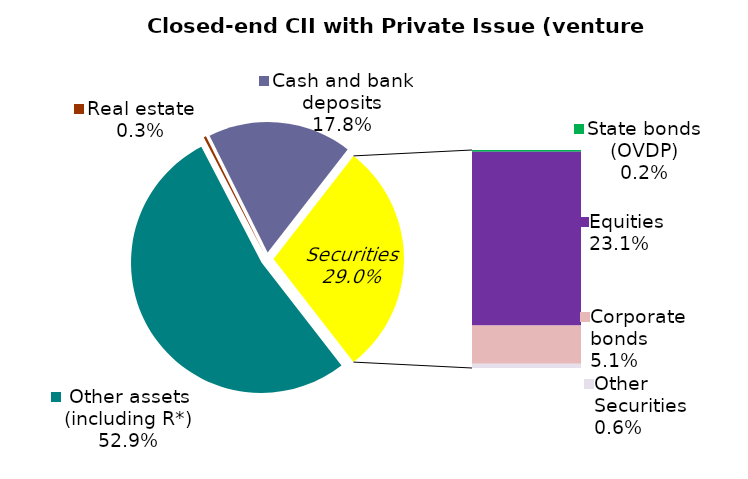
| Category | Series 0 |
|---|---|
| Other assets (including R*) | 0.529 |
| Real estate | 0.003 |
| Cash and bank deposits | 0.178 |
| State bonds (OVDP) | 0.002 |
| Equities | 0.231 |
| Corporate bonds | 0.051 |
| Other Securities | 0.006 |